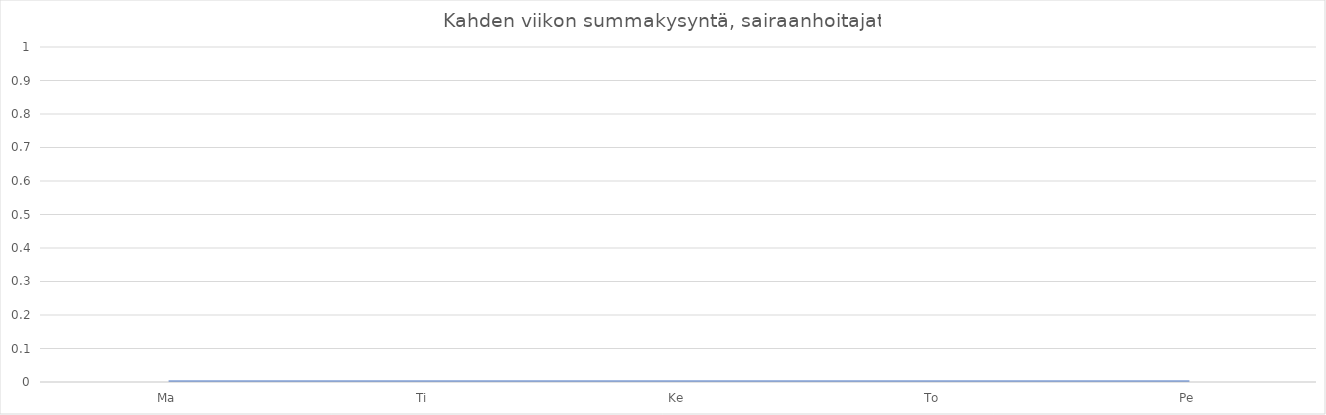
| Category | Series 0 |
|---|---|
| Ma | 0 |
| Ti | 0 |
| Ke | 0 |
| To | 0 |
| Pe | 0 |